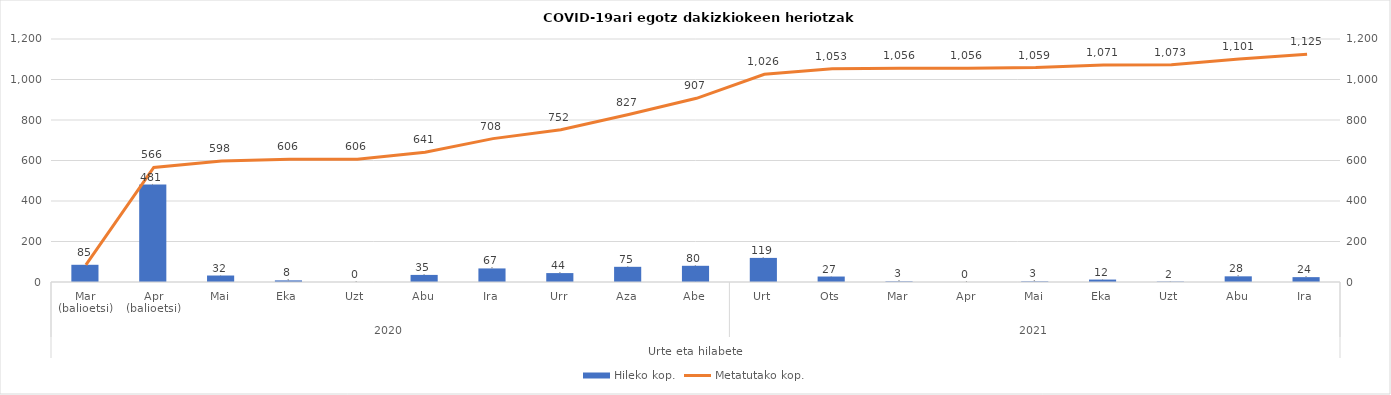
| Category | Hileko kop. |
|---|---|
| 0 | 85 |
| 1 | 481 |
| 2 | 32 |
| 3 | 8 |
| 4 | 0 |
| 5 | 35 |
| 6 | 67 |
| 7 | 44 |
| 8 | 75 |
| 9 | 80 |
| 10 | 119 |
| 11 | 27 |
| 12 | 3 |
| 13 | 0 |
| 14 | 3 |
| 15 | 12 |
| 16 | 2 |
| 17 | 28 |
| 18 | 24 |